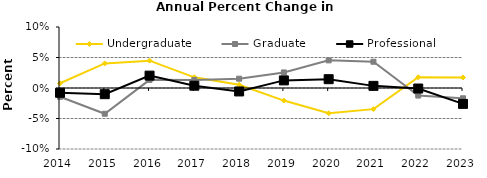
| Category | Undergraduate | Graduate | Professional |
|---|---|---|---|
| 2014.0 | 0.008 | -0.014 | -0.008 |
| 2015.0 | 0.04 | -0.042 | -0.01 |
| 2016.0 | 0.045 | 0.013 | 0.02 |
| 2017.0 | 0.018 | 0.013 | 0.004 |
| 2018.0 | 0.005 | 0.015 | -0.006 |
| 2019.0 | -0.021 | 0.026 | 0.012 |
| 2020.0 | -0.041 | 0.045 | 0.014 |
| 2021.0 | -0.035 | 0.043 | 0.003 |
| 2022.0 | 0.018 | -0.012 | -0.001 |
| 2023.0 | 0.017 | -0.017 | -0.026 |